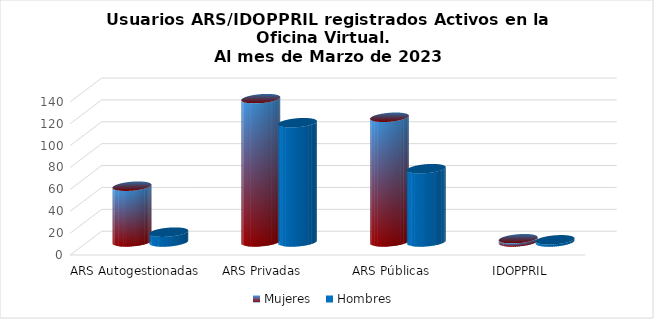
| Category | Mujeres | Hombres |
|---|---|---|
| ARS Autogestionadas | 51 | 9 |
| ARS Privadas | 131 | 109 |
| ARS Públicas | 114 | 67 |
| IDOPPRIL | 3 | 2 |